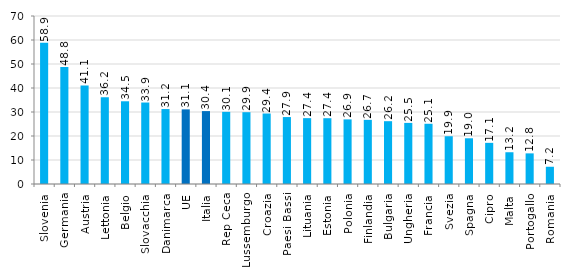
| Category | Series 0 |
|---|---|
| Slovenia | 58.851 |
| Germania | 48.771 |
| Austria | 41.091 |
| Lettonia | 36.175 |
| Belgio | 34.468 |
| Slovacchia | 33.947 |
| Danimarca | 31.224 |
| UE | 31.091 |
| Italia | 30.38 |
| Rep Ceca | 30.067 |
| Lussemburgo | 29.921 |
| Croazia | 29.371 |
| Paesi Bassi | 27.895 |
| Lituania | 27.442 |
| Estonia | 27.413 |
| Polonia | 26.92 |
| Finlandia | 26.726 |
| Bulgaria | 26.169 |
| Ungheria | 25.458 |
| Francia | 25.092 |
| Svezia | 19.904 |
| Spagna | 19.049 |
| Cipro | 17.143 |
| Malta | 13.231 |
| Portogallo | 12.76 |
| Romania | 7.184 |